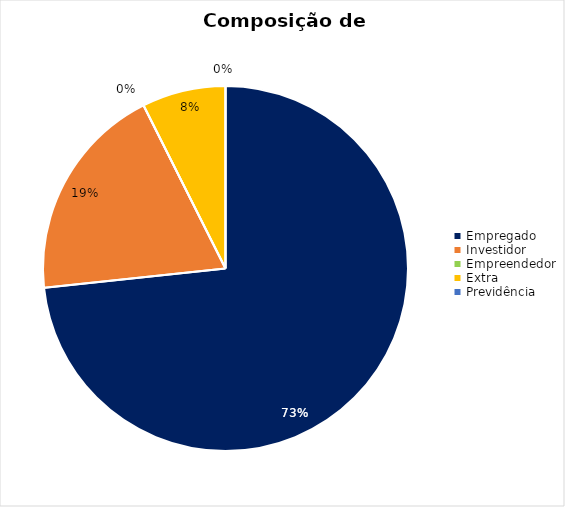
| Category | Fontes |
|---|---|
| Empregado | 2966.667 |
| Investidor | 780 |
| Empreendedor | 0 |
| Extra | 300 |
| Previdência | 0 |